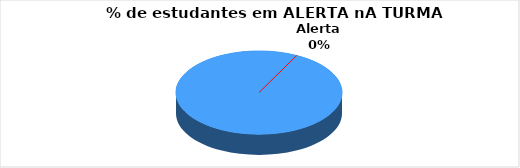
| Category | Series 0 |
|---|---|
| Alerta | 0 |
| Normal | 3 |